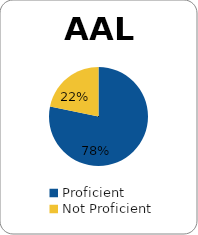
| Category | Series 0 |
|---|---|
| Proficient | 0.783 |
| Not Proficient | 0.217 |